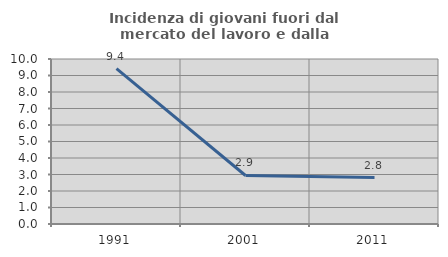
| Category | Incidenza di giovani fuori dal mercato del lavoro e dalla formazione  |
|---|---|
| 1991.0 | 9.42 |
| 2001.0 | 2.941 |
| 2011.0 | 2.817 |